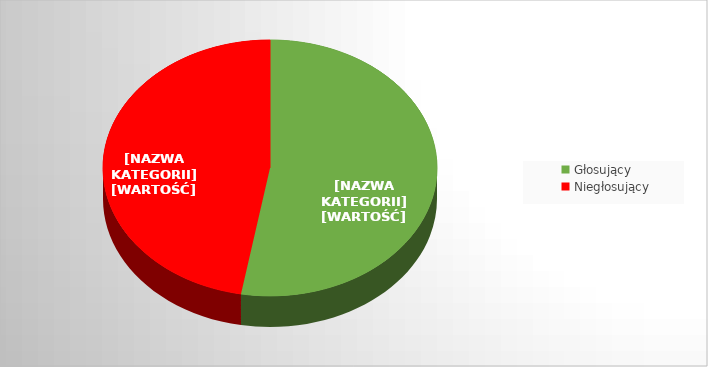
| Category | Series 0 |
|---|---|
| Głosujący | 0.528 |
| Niegłosujący | 0.472 |